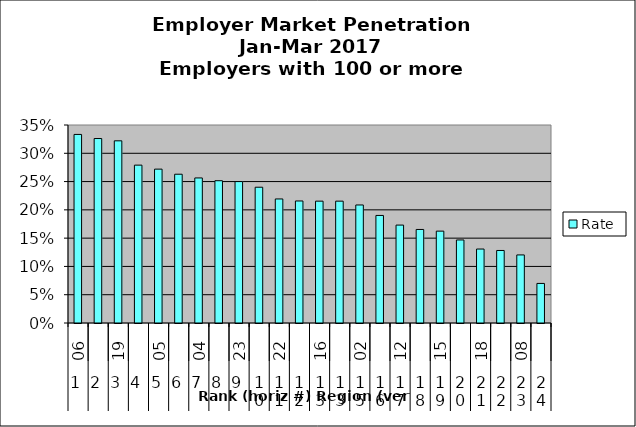
| Category | Rate |
|---|---|
| 0 | 0.333 |
| 1 | 0.326 |
| 2 | 0.322 |
| 3 | 0.279 |
| 4 | 0.272 |
| 5 | 0.263 |
| 6 | 0.256 |
| 7 | 0.252 |
| 8 | 0.25 |
| 9 | 0.24 |
| 10 | 0.219 |
| 11 | 0.216 |
| 12 | 0.215 |
| 13 | 0.215 |
| 14 | 0.209 |
| 15 | 0.19 |
| 16 | 0.173 |
| 17 | 0.165 |
| 18 | 0.162 |
| 19 | 0.147 |
| 20 | 0.131 |
| 21 | 0.128 |
| 22 | 0.12 |
| 23 | 0.07 |